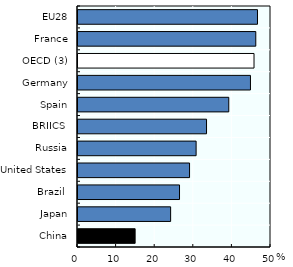
| Category | Series 1 |
|---|---|
| China | 14.8 |
| Japan | 24 |
| Brazil  | 26.3 |
| United States | 28.9 |
| Russia | 30.6 |
| BRIICS  | 33.3 |
| Spain | 39.06 |
| Germany | 44.68 |
| OECD (3) | 45.6 |
| France | 46.06 |
| EU28 | 46.5 |